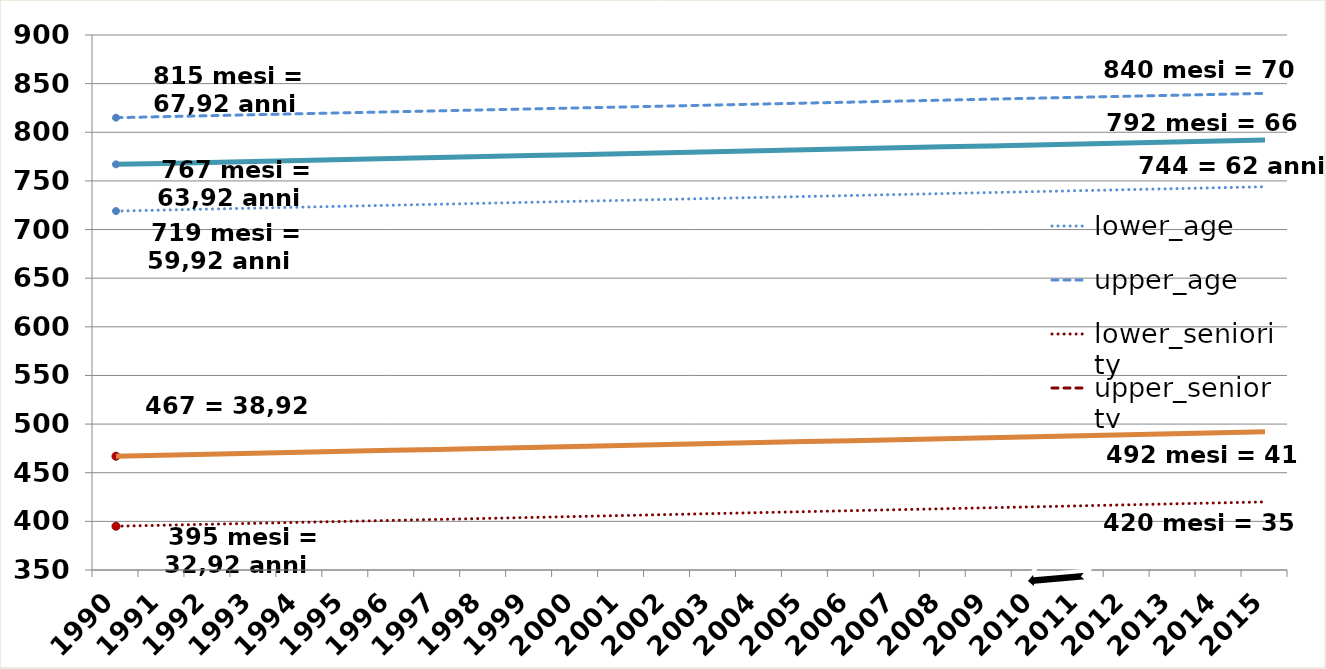
| Category | lower_age | upper_age | lower_seniority | upper_seniority | stnd_age | stnd_seniority |
|---|---|---|---|---|---|---|
| 1990.0 | 719 | 815 | 395 | 467 | 767 | 467 |
| 1991.0 | 720 | 816 | 396 | 468 | 768 | 468 |
| 1992.0 | 721 | 817 | 397 | 469 | 769 | 469 |
| 1993.0 | 722 | 818 | 398 | 470 | 770 | 470 |
| 1994.0 | 723 | 819 | 399 | 471 | 771 | 471 |
| 1995.0 | 724 | 820 | 400 | 472 | 772 | 472 |
| 1996.0 | 725 | 821 | 401 | 473 | 773 | 473 |
| 1997.0 | 726 | 822 | 402 | 474 | 774 | 474 |
| 1998.0 | 727 | 823 | 403 | 475 | 775 | 475 |
| 1999.0 | 728 | 824 | 404 | 476 | 776 | 476 |
| 2000.0 | 729 | 825 | 405 | 477 | 777 | 477 |
| 2001.0 | 730 | 826 | 406 | 478 | 778 | 478 |
| 2002.0 | 731 | 827 | 407 | 479 | 779 | 479 |
| 2003.0 | 732 | 828 | 408 | 480 | 780 | 480 |
| 2004.0 | 733 | 829 | 409 | 481 | 781 | 481 |
| 2005.0 | 734 | 830 | 410 | 482 | 782 | 482 |
| 2006.0 | 735 | 831 | 411 | 483 | 783 | 483 |
| 2007.0 | 736 | 832 | 412 | 484 | 784 | 484 |
| 2008.0 | 737 | 833 | 413 | 485 | 785 | 485 |
| 2009.0 | 738 | 834 | 414 | 486 | 786 | 486 |
| 2010.0 | 739 | 835 | 415 | 487 | 787 | 487 |
| 2011.0 | 740 | 836 | 416 | 488 | 788 | 488 |
| 2012.0 | 741 | 837 | 417 | 489 | 789 | 489 |
| 2013.0 | 742 | 838 | 418 | 490 | 790 | 490 |
| 2014.0 | 743 | 839 | 419 | 491 | 791 | 491 |
| 2015.0 | 744 | 840 | 420 | 492 | 792 | 492 |